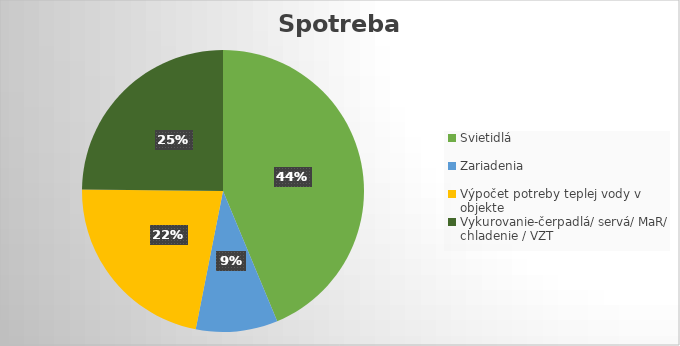
| Category | Spotreba kWh |
|---|---|
| Svietidlá | 4950 |
| Zariadenia | 1062.5 |
| Výpočet potreby teplej vody v objekte | 2500 |
| Vykurovanie-čerpadlá/ servá/ MaR/ chladenie / VZT | 2809.901 |